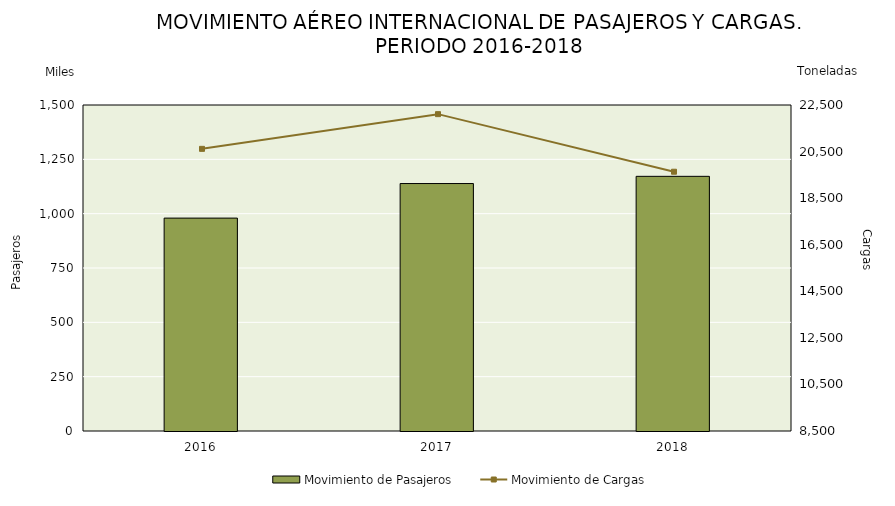
| Category | Movimiento de Pasajeros |
|---|---|
| 2016.0 | 979.563 |
| 2017.0 | 1138.612 |
| 2018.0 | 1171.764 |